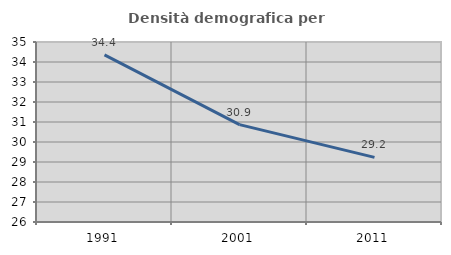
| Category | Densità demografica |
|---|---|
| 1991.0 | 34.359 |
| 2001.0 | 30.87 |
| 2011.0 | 29.231 |